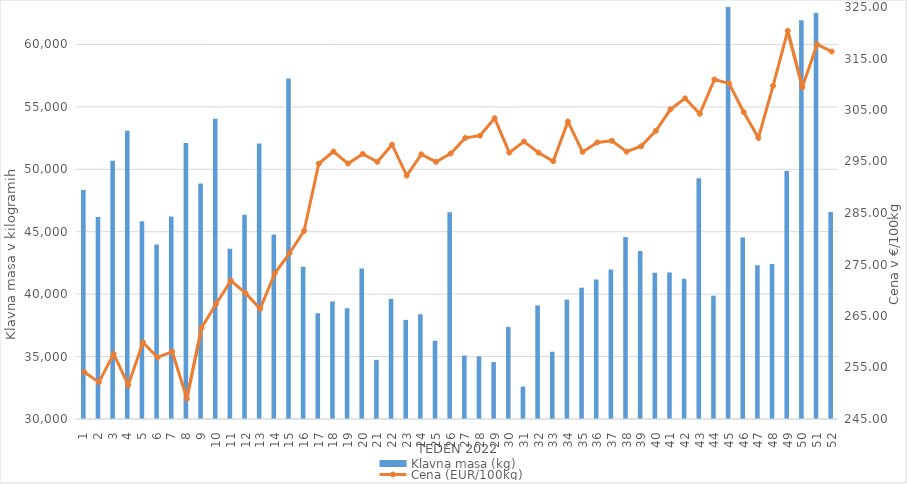
| Category | Klavna masa (kg) |
|---|---|
| 1.0 | 48349 |
| 2.0 | 46187 |
| 3.0 | 50692 |
| 4.0 | 53081 |
| 5.0 | 45844 |
| 6.0 | 43982 |
| 7.0 | 46227 |
| 8.0 | 52099 |
| 9.0 | 48872 |
| 10.0 | 54045 |
| 11.0 | 43645 |
| 12.0 | 46350 |
| 13.0 | 52061 |
| 14.0 | 44774 |
| 15.0 | 57268 |
| 16.0 | 42191 |
| 17.0 | 38469 |
| 18.0 | 39417 |
| 19.0 | 38876 |
| 20.0 | 42047 |
| 21.0 | 34739 |
| 22.0 | 39626 |
| 23.0 | 37939 |
| 24.0 | 38390 |
| 25.0 | 36272 |
| 26.0 | 46553 |
| 27.0 | 35085 |
| 28.0 | 35007 |
| 29.0 | 34559 |
| 30.0 | 37366 |
| 31.0 | 32599 |
| 32.0 | 39100 |
| 33.0 | 35388 |
| 34.0 | 39563 |
| 35.0 | 40507 |
| 36.0 | 41176 |
| 37.0 | 41983 |
| 38.0 | 44572 |
| 39.0 | 43447 |
| 40.0 | 41711 |
| 41.0 | 41736 |
| 42.0 | 41239 |
| 43.0 | 49284 |
| 44.0 | 39877 |
| 45.0 | 63668 |
| 46.0 | 44528 |
| 47.0 | 42319 |
| 48.0 | 42416 |
| 49.0 | 49873 |
| 50.0 | 61942 |
| 51.0 | 62514 |
| 52.0 | 46589 |